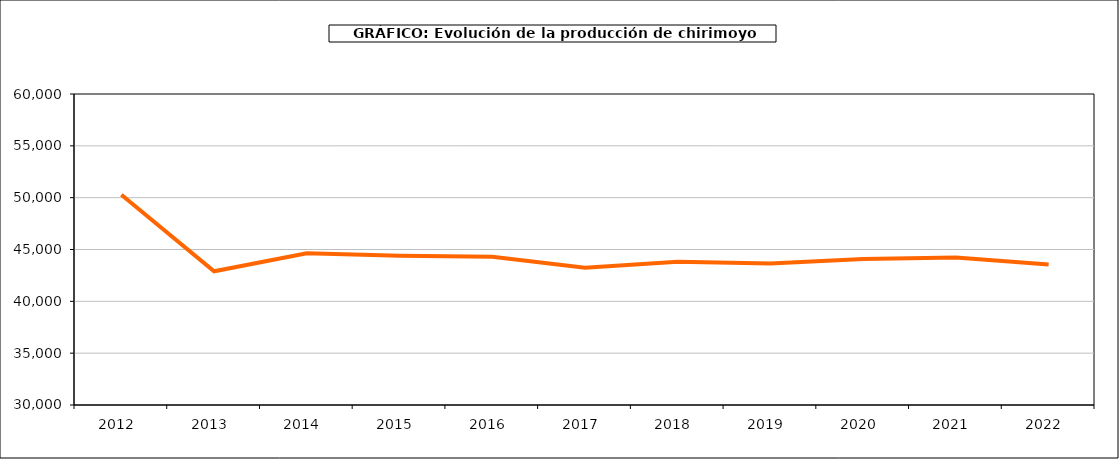
| Category | producción chirimoyo |
|---|---|
| 2012.0 | 50285 |
| 2013.0 | 42898 |
| 2014.0 | 44629 |
| 2015.0 | 44389 |
| 2016.0 | 44305 |
| 2017.0 | 43251 |
| 2018.0 | 43823 |
| 2019.0 | 43645 |
| 2020.0 | 44081 |
| 2021.0 | 44231 |
| 2022.0 | 43548 |